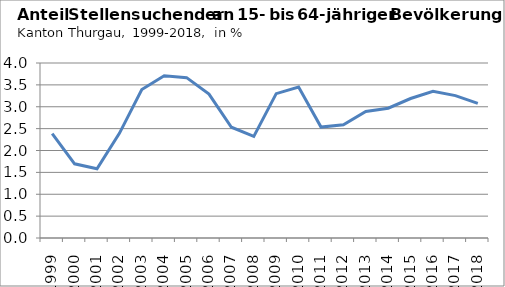
| Category | Anteil an 15- bis 64-jähriger Bevölkerung
in % |
|---|---|
| 1999.0 | 2.384 |
| 2000.0 | 1.696 |
| 2001.0 | 1.582 |
| 2002.0 | 2.392 |
| 2003.0 | 3.392 |
| 2004.0 | 3.709 |
| 2005.0 | 3.665 |
| 2006.0 | 3.288 |
| 2007.0 | 2.532 |
| 2008.0 | 2.321 |
| 2009.0 | 3.3 |
| 2010.0 | 3.453 |
| 2011.0 | 2.535 |
| 2012.0 | 2.589 |
| 2013.0 | 2.892 |
| 2014.0 | 2.966 |
| 2015.0 | 3.188 |
| 2016.0 | 3.355 |
| 2017.0 | 3.254 |
| 2018.0 | 3.076 |